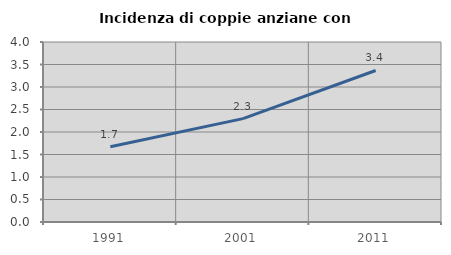
| Category | Incidenza di coppie anziane con figli |
|---|---|
| 1991.0 | 1.67 |
| 2001.0 | 2.298 |
| 2011.0 | 3.367 |